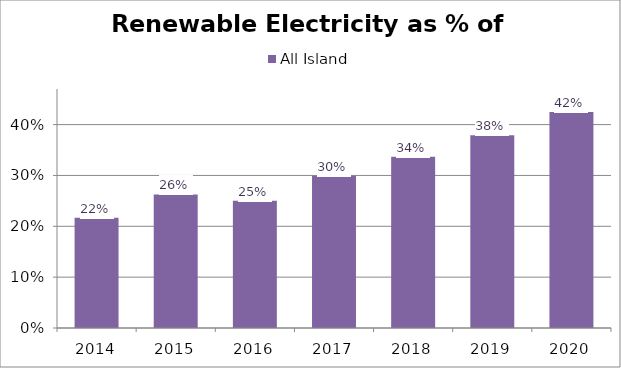
| Category | All Island |
|---|---|
| 2014.0 | 0.217 |
| 2015.0 | 0.263 |
| 2016.0 | 0.25 |
| 2017.0 | 0.299 |
| 2018.0 | 0.337 |
| 2019.0 | 0.379 |
| 2020.0 | 0.425 |